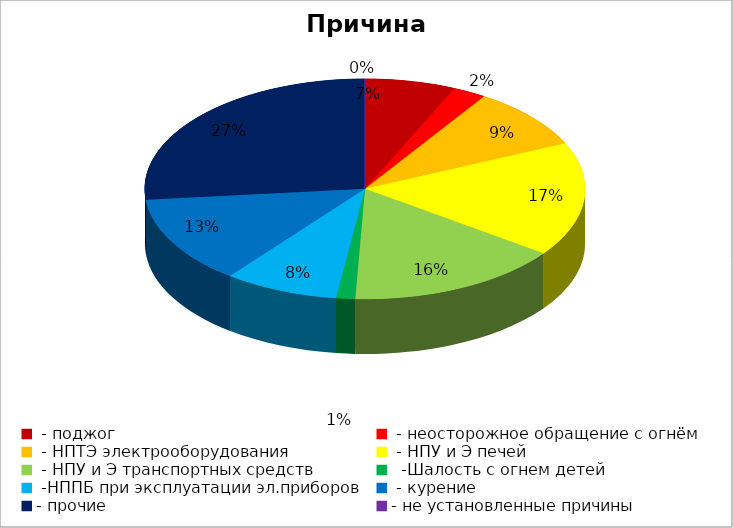
| Category | Причина пожара |
|---|---|
|  - поджог | 19 |
|  - неосторожное обращение с огнём | 7 |
|  - НПТЭ электрооборудования | 26 |
|  - НПУ и Э печей | 48 |
|  - НПУ и Э транспортных средств | 45 |
|   -Шалость с огнем детей | 4 |
|  -НППБ при эксплуатации эл.приборов | 24 |
|  - курение | 37 |
| - прочие | 76 |
| - не установленные причины | 0 |